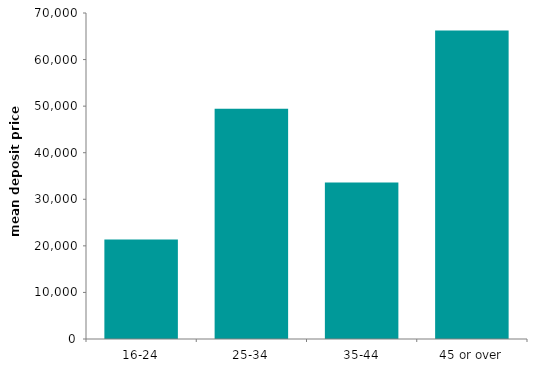
| Category | first-time buyers |
|---|---|
| 16-24 | 21388.899 |
| 25-34 | 49434.728 |
| 35-44 | 33606.777 |
| 45 or over | 66218.249 |